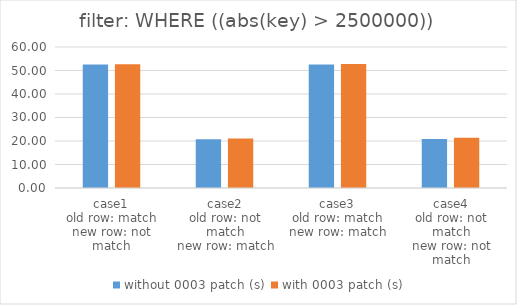
| Category | without 0003 patch (s) | with 0003 patch (s) |
|---|---|---|
| case1
old row: match
new row: not match | 52.527 | 52.644 |
| case2
old row: not match
new row: match | 20.745 | 21.021 |
| case3
old row: match
new row: match | 52.557 | 52.725 |
| case4
old row: not match
new row: not match | 20.843 | 21.347 |